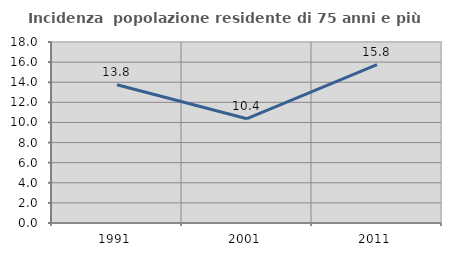
| Category | Incidenza  popolazione residente di 75 anni e più |
|---|---|
| 1991.0 | 13.75 |
| 2001.0 | 10.37 |
| 2011.0 | 15.757 |